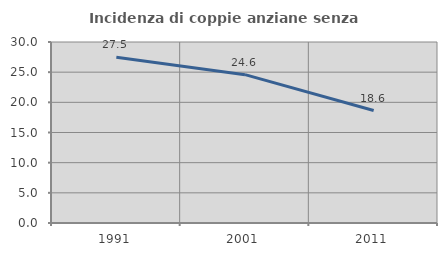
| Category | Incidenza di coppie anziane senza figli  |
|---|---|
| 1991.0 | 27.473 |
| 2001.0 | 24.59 |
| 2011.0 | 18.644 |